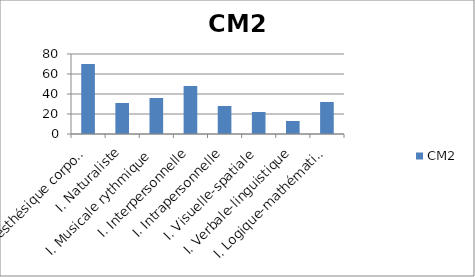
| Category | CM2 |
|---|---|
| I. Kinesthésique corporelle | 70 |
| I. Naturaliste | 31 |
| I. Musicale rythmique | 36 |
| I. Interpersonnelle | 48 |
| I. Intrapersonnelle | 28 |
| I. Visuelle-spatiale | 22 |
| I. Verbale-linguistique | 13 |
| I. Logique-mathématiques | 32 |